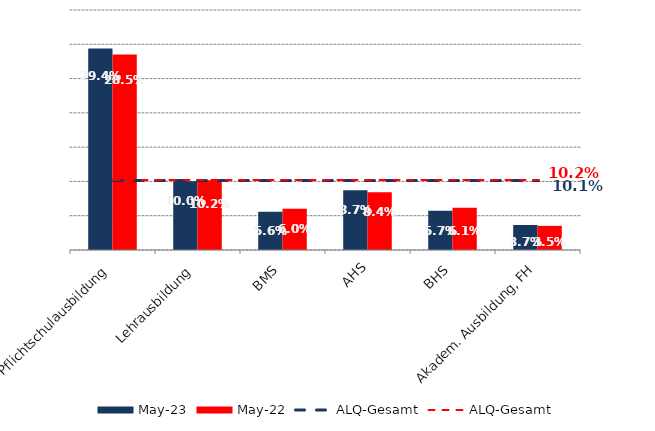
| Category | Mai 23 | Mai 22 |
|---|---|---|
| Pflichtschulausbildung | 0.294 | 0.285 |
| Lehrausbildung | 0.1 | 0.102 |
| BMS | 0.056 | 0.06 |
| AHS | 0.087 | 0.084 |
| BHS | 0.057 | 0.061 |
| Akadem. Ausbildung, FH | 0.037 | 0.035 |